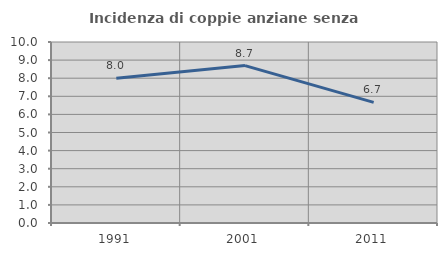
| Category | Incidenza di coppie anziane senza figli  |
|---|---|
| 1991.0 | 8 |
| 2001.0 | 8.696 |
| 2011.0 | 6.667 |